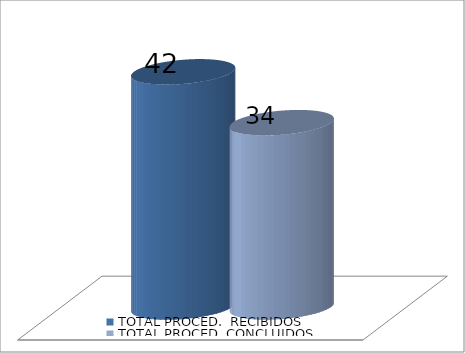
| Category | TOTAL PROCED.  RECIBIDOS | TOTAL PROCED. CONCLUIDOS |
|---|---|---|
| 0 | 42 | 34 |